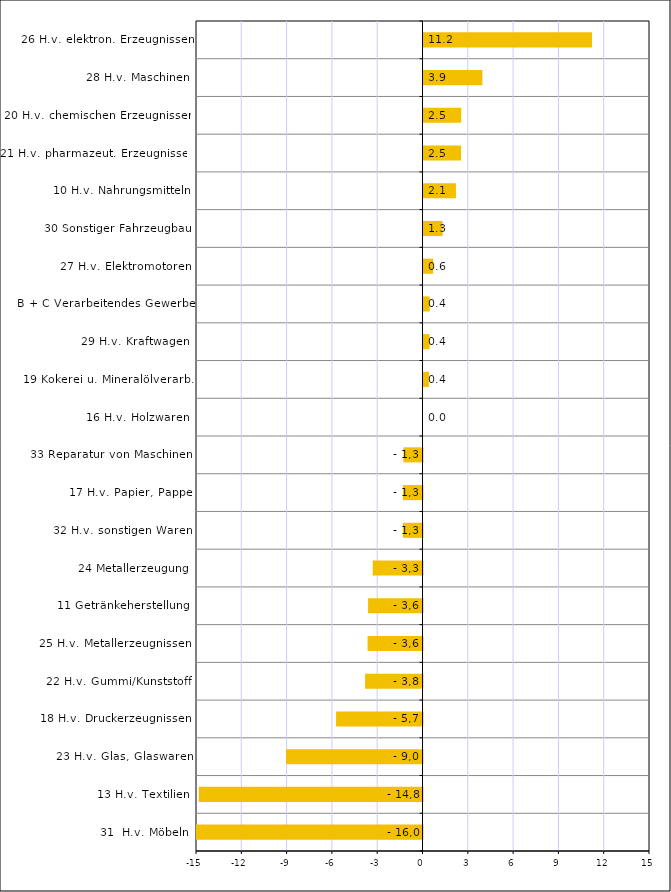
| Category | Series 0 |
|---|---|
| 31  H.v. Möbeln | -16.012 |
| 13 H.v. Textilien | -14.815 |
| 23 H.v. Glas, Glaswaren | -9.035 |
| 18 H.v. Druckerzeugnissen | -5.725 |
| 22 H.v. Gummi/Kunststoff | -3.804 |
| 25 H.v. Metallerzeugnissen | -3.636 |
| 11 Getränkeherstellung | -3.604 |
| 24 Metallerzeugung | -3.297 |
| 32 H.v. sonstigen Waren | -1.297 |
| 17 H.v. Papier, Pappe | -1.294 |
| 33 Reparatur von Maschinen | -1.263 |
| 16 H.v. Holzwaren | 0 |
| 19 Kokerei u. Mineralölverarb. | 0.359 |
| 29 H.v. Kraftwagen | 0.403 |
| B + C Verarbeitendes Gewerbe | 0.411 |
| 27 H.v. Elektromotoren | 0.64 |
| 30 Sonstiger Fahrzeugbau | 1.269 |
| 10 H.v. Nahrungsmitteln | 2.149 |
| 21 H.v. pharmazeut. Erzeugnissen | 2.489 |
| 20 H.v. chemischen Erzeugnissen | 2.499 |
| 28 H.v. Maschinen | 3.901 |
| 26 H.v. elektron. Erzeugnissen | 11.161 |